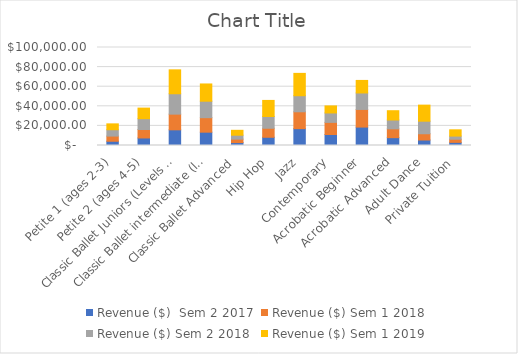
| Category | Revenue ($) |
|---|---|
| Petite 1 (ages 2-3) | 6000 |
| Petite 2 (ages 4-5) | 10800 |
| Classic Ballet Juniors (Levels 1-3) | 24400 |
| Classic Ballet intermediate (levels 4-5) | 17600 |
| Classic Ballet Advanced | 5000 |
| Hip Hop | 16400 |
| Jazz | 22800 |
| Contemporary | 7200 |
| Acrobatic Beginner | 12800 |
| Acrobatic Advanced | 9500 |
| Adult Dance | 16400 |
| Private Tuition | 6400 |